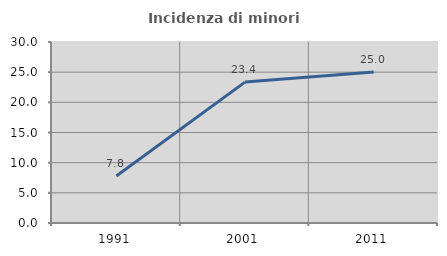
| Category | Incidenza di minori stranieri |
|---|---|
| 1991.0 | 7.778 |
| 2001.0 | 23.353 |
| 2011.0 | 25.009 |